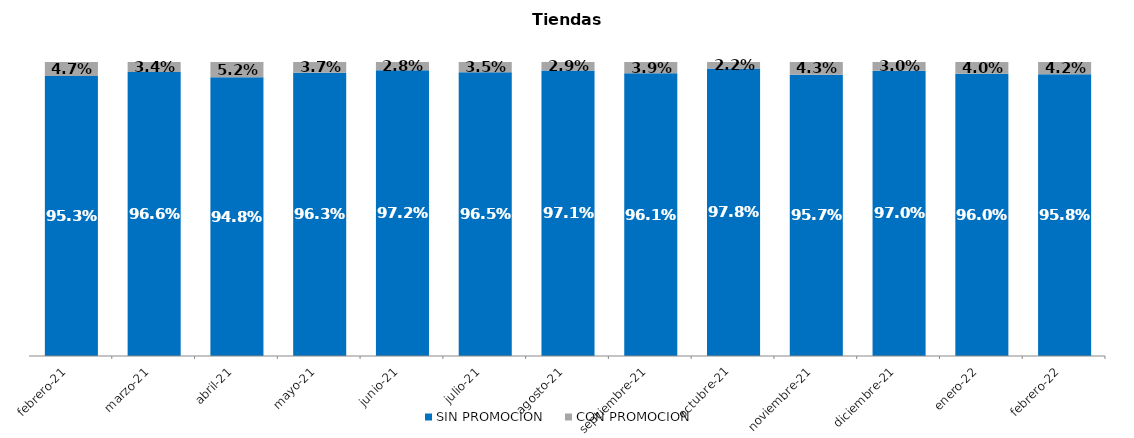
| Category | SIN PROMOCION   | CON PROMOCION   |
|---|---|---|
| 2021-02-01 | 0.953 | 0.047 |
| 2021-03-01 | 0.966 | 0.034 |
| 2021-04-01 | 0.948 | 0.052 |
| 2021-05-01 | 0.963 | 0.037 |
| 2021-06-01 | 0.972 | 0.028 |
| 2021-07-01 | 0.965 | 0.035 |
| 2021-08-01 | 0.971 | 0.029 |
| 2021-09-01 | 0.961 | 0.039 |
| 2021-10-01 | 0.978 | 0.022 |
| 2021-11-01 | 0.957 | 0.043 |
| 2021-12-01 | 0.97 | 0.03 |
| 2022-01-01 | 0.96 | 0.04 |
| 2022-02-01 | 0.958 | 0.042 |